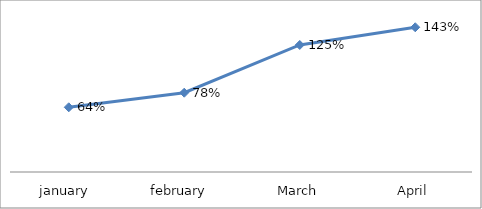
| Category | PERCENTAGE |
|---|---|
| january  | 0.639 |
| february  | 0.783 |
| March | 1.254 |
| April | 1.43 |